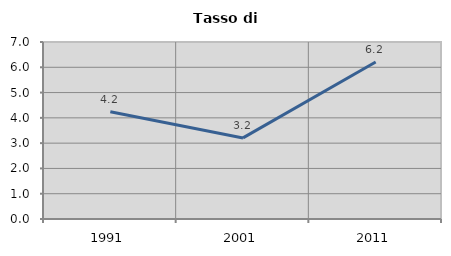
| Category | Tasso di disoccupazione   |
|---|---|
| 1991.0 | 4.242 |
| 2001.0 | 3.207 |
| 2011.0 | 6.207 |